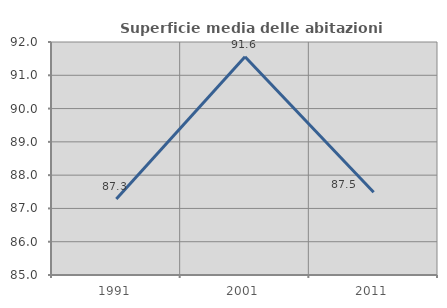
| Category | Superficie media delle abitazioni occupate |
|---|---|
| 1991.0 | 87.28 |
| 2001.0 | 91.554 |
| 2011.0 | 87.486 |